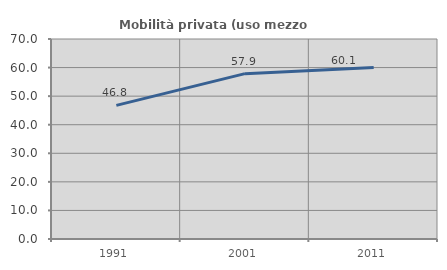
| Category | Mobilità privata (uso mezzo privato) |
|---|---|
| 1991.0 | 46.773 |
| 2001.0 | 57.871 |
| 2011.0 | 60.062 |